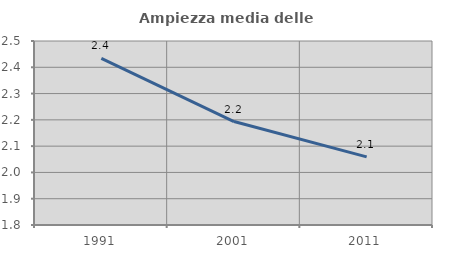
| Category | Ampiezza media delle famiglie |
|---|---|
| 1991.0 | 2.434 |
| 2001.0 | 2.194 |
| 2011.0 | 2.059 |